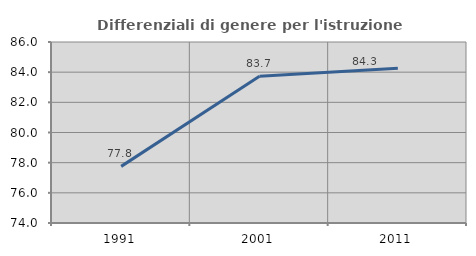
| Category | Differenziali di genere per l'istruzione superiore |
|---|---|
| 1991.0 | 77.754 |
| 2001.0 | 83.722 |
| 2011.0 | 84.262 |